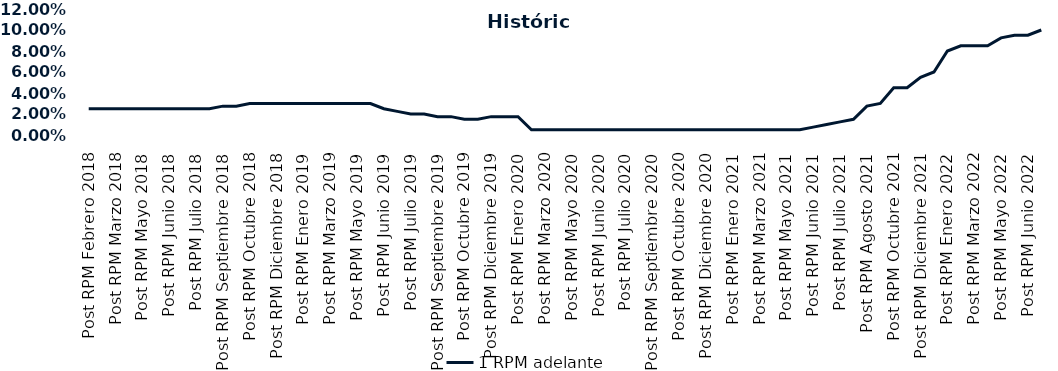
| Category | 1 RPM adelante |
|---|---|
| Post RPM Febrero 2018 | 0.025 |
| Pre RPM Marzo 2018 | 0.025 |
| Post RPM Marzo 2018 | 0.025 |
| Pre RPM Mayo 2018 | 0.025 |
| Post RPM Mayo 2018 | 0.025 |
| Pre RPM Junio 2018 | 0.025 |
| Post RPM Junio 2018 | 0.025 |
| Pre RPM Julio 2018 | 0.025 |
| Post RPM Julio 2018 | 0.025 |
| Pre RPM Septiembre 2018 | 0.025 |
| Post RPM Septiembre 2018 | 0.028 |
| Pre RPM Octubre 2018 | 0.028 |
| Post RPM Octubre 2018 | 0.03 |
| Pre RPM Diciembre 2018 | 0.03 |
| Post RPM Diciembre 2018 | 0.03 |
| Pre RPM Enero 2019 | 0.03 |
| Post RPM Enero 2019 | 0.03 |
| Pre RPM Marzo 2019 | 0.03 |
| Post RPM Marzo 2019 | 0.03 |
| Pre RPM Mayo 2019 | 0.03 |
| Post RPM Mayo 2019 | 0.03 |
| Pre RPM Junio 2019 | 0.03 |
| Post RPM Junio 2019 | 0.025 |
| Pre RPM Julio 2019 | 0.022 |
| Post RPM Julio 2019 | 0.02 |
| Pre RPM Septiembre 2019 | 0.02 |
| Post RPM Septiembre 2019 | 0.018 |
| Pre RPM Octubre 2019 | 0.018 |
| Post RPM Octubre 2019 | 0.015 |
| Pre RPM Diciembre 2019 | 0.015 |
| Post RPM Diciembre 2019 | 0.018 |
| Pre RPM Enero 2020 | 0.018 |
| Post RPM Enero 2020 | 0.018 |
| Pre RPM Marzo 2020 | 0.005 |
| Post RPM Marzo 2020 | 0.005 |
| Pre RPM Mayo 2020 | 0.005 |
| Post RPM Mayo 2020 | 0.005 |
| Pre RPM Junio 2020 | 0.005 |
| Post RPM Junio 2020 | 0.005 |
| Pre RPM Julio 2020 | 0.005 |
| Post RPM Julio 2020 | 0.005 |
| Pre RPM Septiembre 2020 | 0.005 |
| Post RPM Septiembre 2020 | 0.005 |
| Pre RPM Octubre 2020 | 0.005 |
| Post RPM Octubre 2020 | 0.005 |
| Pre RPM Diciembre 2020 | 0.005 |
| Post RPM Diciembre 2020 | 0.005 |
| Pre RPM Enero 2021 | 0.005 |
| Post RPM Enero 2021 | 0.005 |
| Pre RPM Marzo 2021 | 0.005 |
| Post RPM Marzo 2021 | 0.005 |
| Pre RPM Mayo 2021 | 0.005 |
| Post RPM Mayo 2021 | 0.005 |
| Pre RPM Junio 2021 | 0.005 |
| Post RPM Junio 2021 | 0.008 |
| Pre RPM Julio 2021 | 0.01 |
| Post RPM Julio 2021 | 0.012 |
| Pre RPM Agosto 2021 | 0.015 |
| Post RPM Agosto 2021 | 0.028 |
| Pre RPM Octubre 2021 | 0.03 |
| Post RPM Octubre 2021 | 0.045 |
| Pre RPM Diciembre 2021 | 0.045 |
| Post RPM Diciembre 2021 | 0.055 |
| Pre RPM Enero 2022 | 0.06 |
| Post RPM Enero 2022 | 0.08 |
| Pre RPM Marzo 2022 | 0.085 |
| Post RPM Marzo 2022 | 0.085 |
| Pre RPM Mayo 2022 | 0.085 |
| Post RPM Mayo 2022 | 0.092 |
| Pre RPM Junio 2022 | 0.095 |
| Post RPM Junio 2022 | 0.095 |
| Pre RPM Julio 2022 | 0.1 |